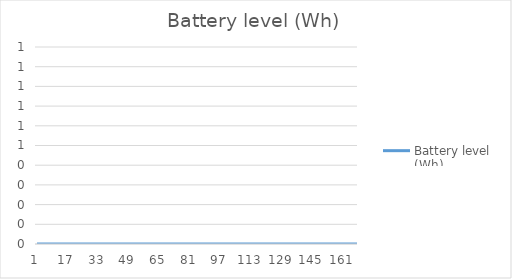
| Category | Battery level (Wh) |
|---|---|
| 0 | 0 |
| 1 | 0 |
| 2 | 0 |
| 3 | 0 |
| 4 | 0 |
| 5 | 0 |
| 6 | 0 |
| 7 | 0 |
| 8 | 0 |
| 9 | 0 |
| 10 | 0 |
| 11 | 0 |
| 12 | 0 |
| 13 | 0 |
| 14 | 0 |
| 15 | 0 |
| 16 | 0 |
| 17 | 0 |
| 18 | 0 |
| 19 | 0 |
| 20 | 0 |
| 21 | 0 |
| 22 | 0 |
| 23 | 0 |
| 24 | 0 |
| 25 | 0 |
| 26 | 0 |
| 27 | 0 |
| 28 | 0 |
| 29 | 0 |
| 30 | 0 |
| 31 | 0 |
| 32 | 0 |
| 33 | 0 |
| 34 | 0 |
| 35 | 0 |
| 36 | 0 |
| 37 | 0 |
| 38 | 0 |
| 39 | 0 |
| 40 | 0 |
| 41 | 0 |
| 42 | 0 |
| 43 | 0 |
| 44 | 0 |
| 45 | 0 |
| 46 | 0 |
| 47 | 0 |
| 48 | 0 |
| 49 | 0 |
| 50 | 0 |
| 51 | 0 |
| 52 | 0 |
| 53 | 0 |
| 54 | 0 |
| 55 | 0 |
| 56 | 0 |
| 57 | 0 |
| 58 | 0 |
| 59 | 0 |
| 60 | 0 |
| 61 | 0 |
| 62 | 0 |
| 63 | 0 |
| 64 | 0 |
| 65 | 0 |
| 66 | 0 |
| 67 | 0 |
| 68 | 0 |
| 69 | 0 |
| 70 | 0 |
| 71 | 0 |
| 72 | 0 |
| 73 | 0 |
| 74 | 0 |
| 75 | 0 |
| 76 | 0 |
| 77 | 0 |
| 78 | 0 |
| 79 | 0 |
| 80 | 0 |
| 81 | 0 |
| 82 | 0 |
| 83 | 0 |
| 84 | 0 |
| 85 | 0 |
| 86 | 0 |
| 87 | 0 |
| 88 | 0 |
| 89 | 0 |
| 90 | 0 |
| 91 | 0 |
| 92 | 0 |
| 93 | 0 |
| 94 | 0 |
| 95 | 0 |
| 96 | 0 |
| 97 | 0 |
| 98 | 0 |
| 99 | 0 |
| 100 | 0 |
| 101 | 0 |
| 102 | 0 |
| 103 | 0 |
| 104 | 0 |
| 105 | 0 |
| 106 | 0 |
| 107 | 0 |
| 108 | 0 |
| 109 | 0 |
| 110 | 0 |
| 111 | 0 |
| 112 | 0 |
| 113 | 0 |
| 114 | 0 |
| 115 | 0 |
| 116 | 0 |
| 117 | 0 |
| 118 | 0 |
| 119 | 0 |
| 120 | 0 |
| 121 | 0 |
| 122 | 0 |
| 123 | 0 |
| 124 | 0 |
| 125 | 0 |
| 126 | 0 |
| 127 | 0 |
| 128 | 0 |
| 129 | 0 |
| 130 | 0 |
| 131 | 0 |
| 132 | 0 |
| 133 | 0 |
| 134 | 0 |
| 135 | 0 |
| 136 | 0 |
| 137 | 0 |
| 138 | 0 |
| 139 | 0 |
| 140 | 0 |
| 141 | 0 |
| 142 | 0 |
| 143 | 0 |
| 144 | 0 |
| 145 | 0 |
| 146 | 0 |
| 147 | 0 |
| 148 | 0 |
| 149 | 0 |
| 150 | 0 |
| 151 | 0 |
| 152 | 0 |
| 153 | 0 |
| 154 | 0 |
| 155 | 0 |
| 156 | 0 |
| 157 | 0 |
| 158 | 0 |
| 159 | 0 |
| 160 | 0 |
| 161 | 0 |
| 162 | 0 |
| 163 | 0 |
| 164 | 0 |
| 165 | 0 |
| 166 | 0 |
| 167 | 0 |